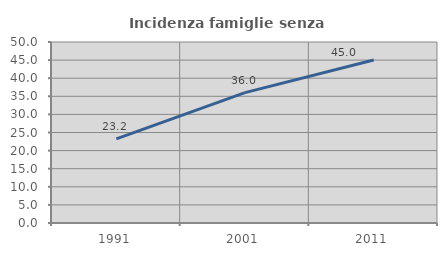
| Category | Incidenza famiglie senza nuclei |
|---|---|
| 1991.0 | 23.239 |
| 2001.0 | 36.025 |
| 2011.0 | 45.029 |